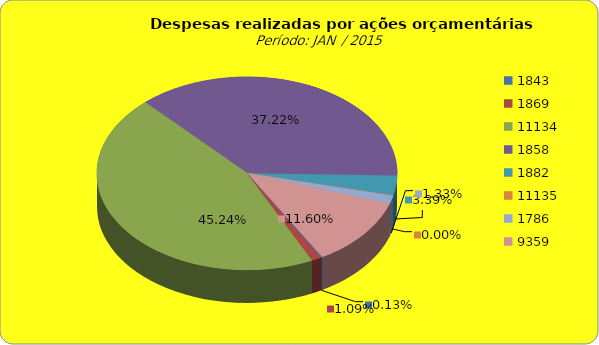
| Category | Series 1 |
|---|---|
| 1843.0 | 40000 |
| 1869.0 | 337447.76 |
| 11134.0 | 14004762.76 |
| 1858.0 | 11523316.8 |
| 1882.0 | 1050265.28 |
| 11135.0 | 0 |
| 1786.0 | 411797.04 |
| 9359.0 | 3592401.34 |